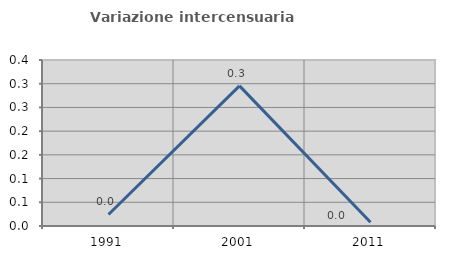
| Category | Variazione intercensuaria annua |
|---|---|
| 1991.0 | 0.024 |
| 2001.0 | 0.296 |
| 2011.0 | 0.008 |